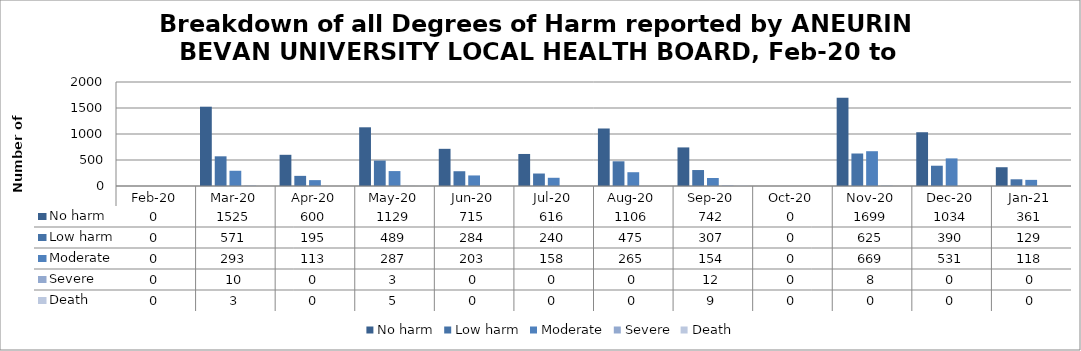
| Category | No harm | Low harm | Moderate | Severe | Death |
|---|---|---|---|---|---|
| Feb-20 | 0 | 0 | 0 | 0 | 0 |
| Mar-20 | 1525 | 571 | 293 | 10 | 3 |
| Apr-20 | 600 | 195 | 113 | 0 | 0 |
| May-20 | 1129 | 489 | 287 | 3 | 5 |
| Jun-20 | 715 | 284 | 203 | 0 | 0 |
| Jul-20 | 616 | 240 | 158 | 0 | 0 |
| Aug-20 | 1106 | 475 | 265 | 0 | 0 |
| Sep-20 | 742 | 307 | 154 | 12 | 9 |
| Oct-20 | 0 | 0 | 0 | 0 | 0 |
| Nov-20 | 1699 | 625 | 669 | 8 | 0 |
| Dec-20 | 1034 | 390 | 531 | 0 | 0 |
| Jan-21 | 361 | 129 | 118 | 0 | 0 |